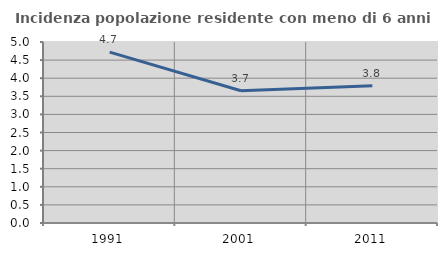
| Category | Incidenza popolazione residente con meno di 6 anni |
|---|---|
| 1991.0 | 4.72 |
| 2001.0 | 3.652 |
| 2011.0 | 3.789 |